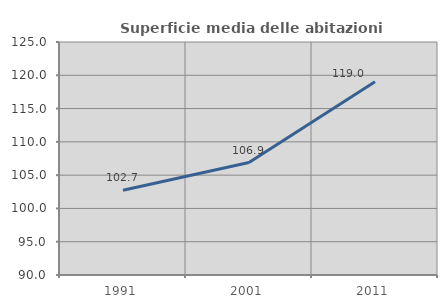
| Category | Superficie media delle abitazioni occupate |
|---|---|
| 1991.0 | 102.736 |
| 2001.0 | 106.897 |
| 2011.0 | 119.015 |